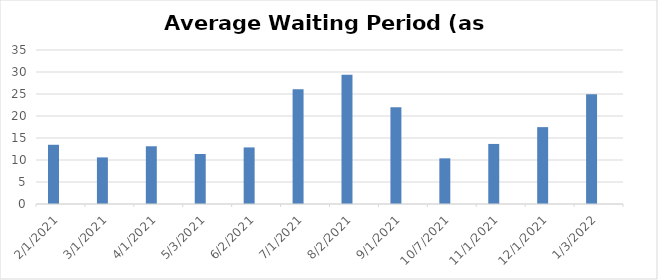
| Category | Current | Series 1 |
|---|---|---|
| 2/1/21 | 13.46 |  |
| 3/1/21 | 10.59 |  |
| 4/1/21 | 13.12 |  |
| 5/3/21 | 11.37 |  |
| 6/2/21 | 12.86 |  |
| 7/1/21 | 26.09 |  |
| 8/2/21 | 29.37 |  |
| 9/1/21 | 21.99 |  |
| 10/7/21 | 10.38 |  |
| 11/1/21 | 13.65 |  |
| 12/1/21 | 17.47 |  |
| 1/3/22 | 24.96 |  |